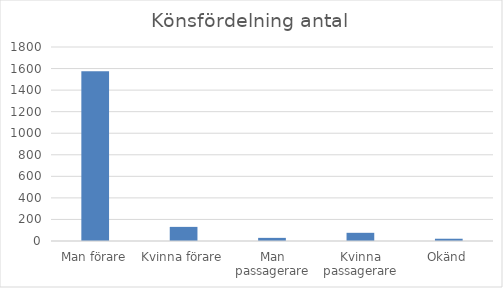
| Category | Antal |
|---|---|
| Man förare | 1576 |
| Kvinna förare | 131 |
| Man passagerare | 29 |
| Kvinna passagerare | 76 |
| Okänd | 21 |